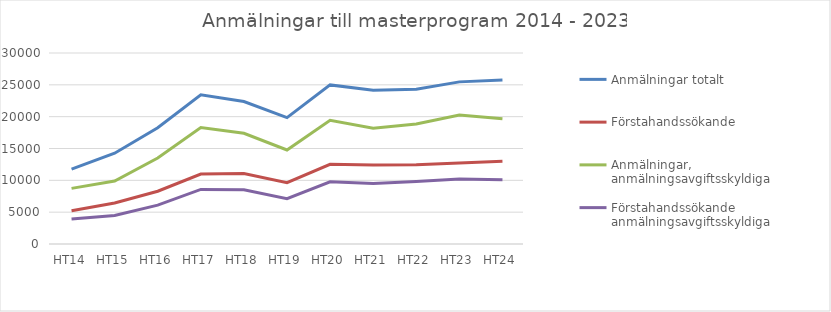
| Category | Anmälningar totalt | Förstahandssökande | Anmälningar, anmälningsavgiftsskyldiga | Förstahandssökande anmälningsavgiftsskyldiga |
|---|---|---|---|---|
| HT14 | 11772 | 5238 | 8736 | 3922 |
| HT15 | 14264 | 6444 | 9895 | 4492 |
| HT16 | 18267 | 8292 | 13514 | 6109 |
| HT17 | 23441 | 10976 | 18305 | 8567 |
| HT18 | 22373 | 11084 | 17395 | 8511 |
| HT19 | 19841 | 9639 | 14762 | 7105 |
| HT20 | 24988 | 12518 | 19430 | 9766 |
| HT21 | 24133 | 12418 | 18187 | 9485 |
| HT22 | 24325 | 12458 | 18835 | 9803 |
| HT23 | 25465 | 12719 | 20249 | 10210 |
| HT24 | 25760 | 12979 | 19671 | 10110 |